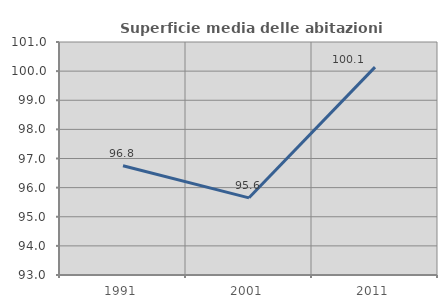
| Category | Superficie media delle abitazioni occupate |
|---|---|
| 1991.0 | 96.75 |
| 2001.0 | 95.65 |
| 2011.0 | 100.136 |